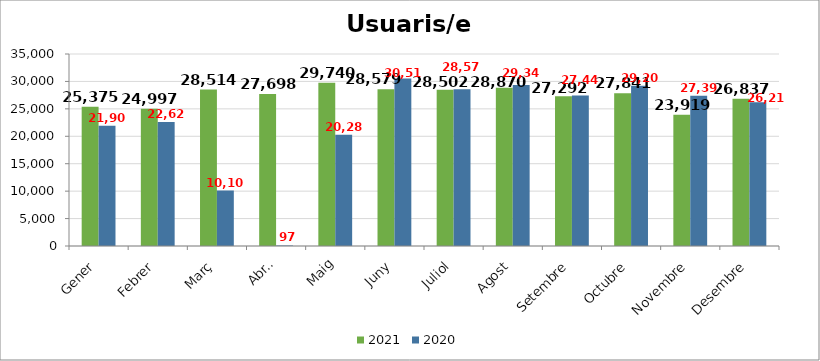
| Category | 2021 | 2020 |
|---|---|---|
| Gener | 25375 | 21905 |
| Febrer | 24997 | 22626 |
| Març | 28514 | 10101 |
| Abril | 27698 | 97 |
| Maig | 29740 | 20287 |
| Juny | 28579 | 30515 |
| Juliol | 28502 | 28579 |
| Agost | 28870 | 29348 |
| Setembre | 27292 | 27441 |
| Octubre | 27841 | 29205 |
| Novembre | 23919 | 27396 |
| Desembre | 26837 | 26216 |